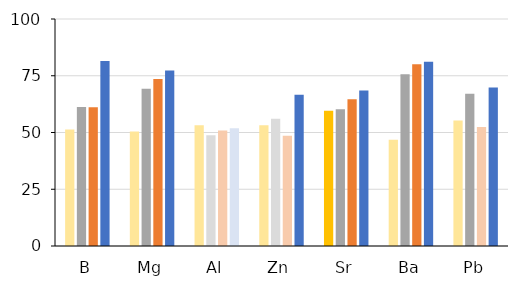
| Category | FO | IOM | ICE | GOM |
|---|---|---|---|---|
| B | 51.376 | 61.25 | 61.111 | 81.481 |
| Mg | 50.459 | 69.231 | 73.611 | 77.358 |
| Al | 53.211 | 48.78 | 50.898 | 51.852 |
| Zn | 53.211 | 56.098 | 48.611 | 66.667 |
| Sr | 59.633 | 60.256 | 64.671 | 68.519 |
| Ba | 46.789 | 75.641 | 80.12 | 81.132 |
| Pb | 55.238 | 67.073 | 52.459 | 69.811 |